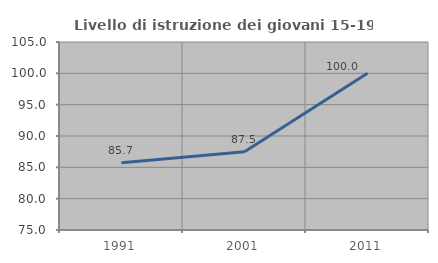
| Category | Livello di istruzione dei giovani 15-19 anni |
|---|---|
| 1991.0 | 85.714 |
| 2001.0 | 87.5 |
| 2011.0 | 100 |